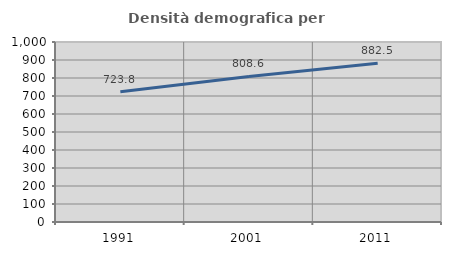
| Category | Densità demografica |
|---|---|
| 1991.0 | 723.814 |
| 2001.0 | 808.586 |
| 2011.0 | 882.477 |